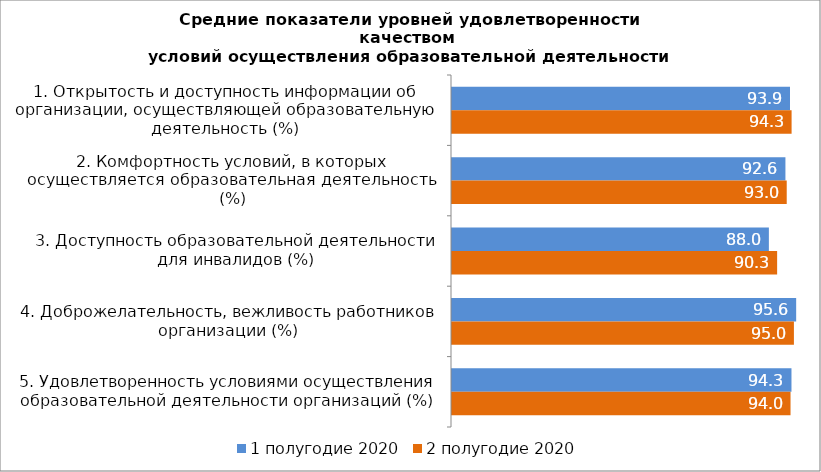
| Category | 1 полугодие 2020 | 2 полугодие 2020 |
|---|---|---|
| 1. Открытость и доступность информации об организации, осуществляющей образовательную деятельность (%) | 93.889 | 94.331 |
| 2. Комфортность условий, в которых осуществляется образовательная деятельность (%) | 92.619 | 92.979 |
| 3. Доступность образовательной деятельности для инвалидов (%) | 88.022 | 90.314 |
| 4. Доброжелательность, вежливость работников организации (%) | 95.601 | 94.977 |
| 5. Удовлетворенность условиями осуществления образовательной деятельности организаций (%) | 94.299 | 94.035 |